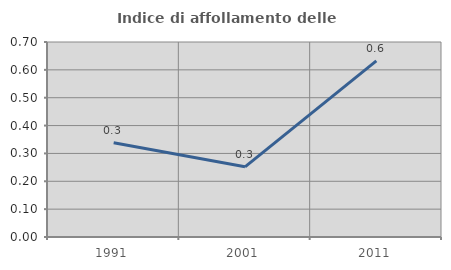
| Category | Indice di affollamento delle abitazioni  |
|---|---|
| 1991.0 | 0.339 |
| 2001.0 | 0.252 |
| 2011.0 | 0.632 |